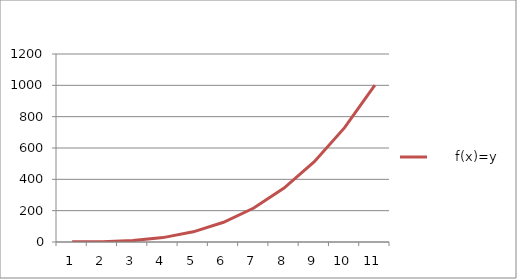
| Category |       f(x)=y |
|---|---|
| 0 | 1 |
| 1 | 2 |
| 2 | 9 |
| 3 | 28 |
| 4 | 65 |
| 5 | 126 |
| 6 | 217 |
| 7 | 344 |
| 8 | 513 |
| 9 | 730 |
| 10 | 1001 |